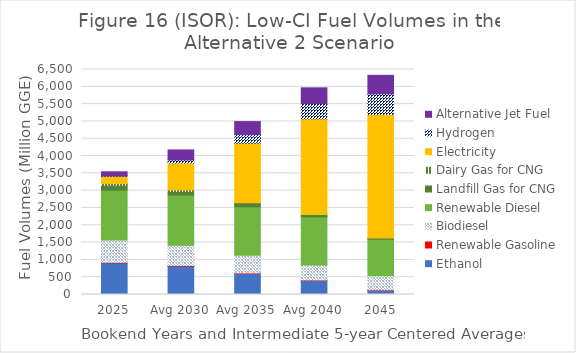
| Category | Ethanol | Renewable Gasoline | Biodiesel | Renewable Diesel | Landfill Gas for CNG | Dairy Gas for CNG | Electricity | Hydrogen | Alternative Jet Fuel |
|---|---|---|---|---|---|---|---|---|---|
| 2025 | 913.355 | 14.062 | 644.244 | 1439.591 | 145.419 | 48.452 | 213.013 | 5.314 | 120.981 |
| Avg 2030 | 823.986 | 14.122 | 586.649 | 1445.727 | 109.742 | 42.431 | 777.105 | 87.448 | 289.308 |
| Avg 2035 | 609.626 | 13.662 | 512.807 | 1398.616 | 116.57 | 0 | 1722.918 | 241.867 | 379.594 |
| Avg 2040 | 404.539 | 13.554 | 435.621 | 1387.647 | 72.937 | 0 | 2762.485 | 436.496 | 457.558 |
| 2045 | 124.439 | 10.282 | 410.443 | 1052.585 | 32.937 | 0 | 3572.892 | 592.954 | 535.522 |